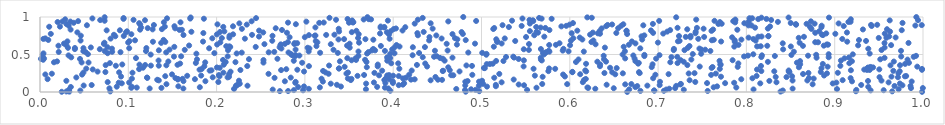
| Category | Series 0 |
|---|---|
| 0.664995956694161 | 0.001 |
| 0.9989362232849331 | 0.002 |
| 0.024639402178469938 | 0.003 |
| 0.482119969089313 | 0.004 |
| 0.03322009494285516 | 0.005 |
| 0.8386567524041421 | 0.006 |
| 0.029859937193917108 | 0.007 |
| 0.07963466957740173 | 0.008 |
| 0.965152407809273 | 0.009 |
| 0.9240435501453452 | 0.01 |
| 0.49744229192761913 | 0.011 |
| 0.2716573092140552 | 0.012 |
| 0.2809765765088632 | 0.013 |
| 0.7561589713562985 | 0.014 |
| 0.6799445542967725 | 0.015 |
| 0.7065505978965135 | 0.016 |
| 0.39665099776993407 | 0.017 |
| 0.6957691135875862 | 0.018 |
| 0.045671469405751175 | 0.019 |
| 0.8412257438737879 | 0.02 |
| 0.6955227239547089 | 0.021 |
| 0.9406701062007451 | 0.022 |
| 0.2979325662061413 | 0.023 |
| 0.9554827139419098 | 0.024 |
| 0.2875414308775337 | 0.025 |
| 0.48135020899788805 | 0.026 |
| 0.5516425678795928 | 0.027 |
| 0.9244853523116181 | 0.028 |
| 0.49333674763497304 | 0.029 |
| 0.7290932280535158 | 0.03 |
| 0.03286770507293879 | 0.031 |
| 0.2635450522684133 | 0.032 |
| 0.7092554660332971 | 0.033 |
| 0.808065388580854 | 0.034 |
| 0.6672584921421142 | 0.035 |
| 0.48823726595747896 | 0.036 |
| 0.36912294008398217 | 0.037 |
| 0.9723795257499287 | 0.038 |
| 0.90263160167634 | 0.039 |
| 0.47145976300835457 | 0.04 |
| 0.21974828644287558 | 0.041 |
| 0.30443231938226845 | 0.042 |
| 0.628869394943446 | 0.043 |
| 0.7126670233093978 | 0.044 |
| 0.852343542686936 | 0.045 |
| 0.16234978106327858 | 0.046 |
| 0.12418896208187746 | 0.047 |
| 0.3944795121743325 | 0.048 |
| 0.07858904973238956 | 0.049 |
| 0.649761555942909 | 0.05 |
| 0.7192745569571316 | 0.051 |
| 0.9863874506443138 | 0.052 |
| 0.9998205607760713 | 0.053 |
| 0.6208467202864248 | 0.054 |
| 0.13751590419339454 | 0.055 |
| 0.10339359894056177 | 0.056 |
| 0.5622760565363885 | 0.057 |
| 0.3906122875469086 | 0.058 |
| 0.10958476435433029 | 0.059 |
| 0.7885634697478714 | 0.06 |
| 0.619932857702622 | 0.061 |
| 0.31694334041106564 | 0.062 |
| 0.7629007265837633 | 0.063 |
| 0.18100451814252205 | 0.064 |
| 0.6742234331277013 | 0.065 |
| 0.29235029882932084 | 0.066 |
| 0.0349049358146577 | 0.067 |
| 0.38183512772812445 | 0.068 |
| 0.9380153457905355 | 0.069 |
| 0.10405561700919053 | 0.07 |
| 0.08690831628308848 | 0.071 |
| 0.5062163441032591 | 0.072 |
| 0.3407870701486322 | 0.073 |
| 0.29898544358545864 | 0.074 |
| 0.7668107779129065 | 0.075 |
| 0.1566914096400247 | 0.076 |
| 0.5162740958150556 | 0.077 |
| 0.22180425773371892 | 0.078 |
| 0.6763732805177392 | 0.079 |
| 0.9677327866136145 | 0.08 |
| 0.9858529557865442 | 0.081 |
| 0.720514249835614 | 0.082 |
| 0.4970140474261846 | 0.083 |
| 0.23497995062268795 | 0.084 |
| 0.6878320533775083 | 0.085 |
| 0.04945418795839285 | 0.086 |
| 0.22231139325291827 | 0.087 |
| 0.4815976988094496 | 0.088 |
| 0.9767111810893743 | 0.089 |
| 0.5482016907851018 | 0.09 |
| 0.40632995556464635 | 0.091 |
| 0.7017643485102744 | 0.092 |
| 0.0585155312332829 | 0.093 |
| 0.9300062283799445 | 0.094 |
| 0.5162392449187526 | 0.095 |
| 0.3362247592345575 | 0.096 |
| 0.6417288786274516 | 0.097 |
| 0.41096644085029566 | 0.098 |
| 0.22392367089158893 | 0.099 |
| 0.5421323926709913 | 0.1 |
| 0.7253654530042826 | 0.101 |
| 0.6627615395295284 | 0.102 |
| 0.8750006179527815 | 0.103 |
| 0.14320060195090445 | 0.104 |
| 0.5970235258154841 | 0.105 |
| 0.6696929063289269 | 0.106 |
| 0.5687658955322499 | 0.107 |
| 0.7257594551004029 | 0.108 |
| 0.5017607079965017 | 0.109 |
| 0.22622253023249483 | 0.11 |
| 0.3292964107008204 | 0.111 |
| 0.36933966101716675 | 0.112 |
| 0.9738164486355505 | 0.113 |
| 0.8977710365653785 | 0.114 |
| 0.815705105575137 | 0.115 |
| 0.0926321880823372 | 0.116 |
| 0.4124002391681474 | 0.117 |
| 0.775897240836362 | 0.118 |
| 0.7554403851241233 | 0.119 |
| 0.39967507265545743 | 0.12 |
| 0.3911147315318967 | 0.121 |
| 0.2891351103196761 | 0.122 |
| 0.7861343288909702 | 0.123 |
| 0.08917332464436845 | 0.124 |
| 0.9019413617657434 | 0.125 |
| 0.10094322744784334 | 0.126 |
| 0.3781922948105787 | 0.127 |
| 0.9610295536397262 | 0.128 |
| 0.5227941025255641 | 0.129 |
| 0.8340503031207283 | 0.13 |
| 0.6147985309024946 | 0.131 |
| 0.07665726391792826 | 0.132 |
| 0.20196275594506352 | 0.133 |
| 0.7420968834665234 | 0.134 |
| 0.28952485133135386 | 0.135 |
| 0.7021593393391504 | 0.136 |
| 0.48165876890882875 | 0.137 |
| 0.4971947760922043 | 0.138 |
| 0.3203820387342028 | 0.139 |
| 0.9871902154081982 | 0.14 |
| 0.399610864715808 | 0.141 |
| 0.9196081852001261 | 0.142 |
| 0.27733536106255363 | 0.143 |
| 0.1873081885730079 | 0.144 |
| 0.16245379734417775 | 0.145 |
| 0.4842512096089482 | 0.146 |
| 0.9377293274724892 | 0.147 |
| 0.8259808009452639 | 0.148 |
| 0.029831812250912026 | 0.149 |
| 0.5006329909631198 | 0.15 |
| 0.2253407610345789 | 0.151 |
| 0.9529939760306166 | 0.152 |
| 0.8522705452006918 | 0.153 |
| 0.8690075208608636 | 0.154 |
| 0.13453700069108454 | 0.155 |
| 0.44239342048419006 | 0.156 |
| 0.7356749778320286 | 0.157 |
| 0.909002447645932 | 0.158 |
| 0.35203578651775913 | 0.159 |
| 0.38996757677737137 | 0.16 |
| 0.6162018890036507 | 0.161 |
| 0.4553527233664628 | 0.162 |
| 0.13274318642951388 | 0.163 |
| 0.45062851908386725 | 0.164 |
| 0.42017824519645364 | 0.165 |
| 0.5364724039135773 | 0.166 |
| 0.15599365604124926 | 0.167 |
| 0.39582947971805627 | 0.168 |
| 0.4243172975310896 | 0.169 |
| 0.7941869137465567 | 0.17 |
| 0.17546334405402086 | 0.171 |
| 0.008597140693546224 | 0.172 |
| 0.15635040332995964 | 0.173 |
| 0.618127302958083 | 0.174 |
| 0.3527485238842816 | 0.175 |
| 0.16138771922750195 | 0.176 |
| 0.3188584174554604 | 0.177 |
| 0.1040769233976967 | 0.178 |
| 0.8762094194310122 | 0.179 |
| 0.34865569882325853 | 0.18 |
| 0.4110970681941938 | 0.181 |
| 0.3916772851655196 | 0.182 |
| 0.8068133030844657 | 0.183 |
| 0.6943733922313157 | 0.184 |
| 0.9180187947152834 | 0.185 |
| 0.15335082269279798 | 0.186 |
| 0.8708185406327933 | 0.187 |
| 0.12151390634799797 | 0.188 |
| 0.26564017037447374 | 0.189 |
| 0.5144401121918051 | 0.19 |
| 0.4144617067269738 | 0.191 |
| 0.28396782460597436 | 0.192 |
| 0.12120098762020137 | 0.193 |
| 0.041132545388296804 | 0.194 |
| 0.21243299640732372 | 0.195 |
| 0.19563203783577177 | 0.196 |
| 0.9716317517880783 | 0.197 |
| 0.9507577447227504 | 0.198 |
| 0.8454109385040243 | 0.199 |
| 0.4478355344444609 | 0.2 |
| 0.833186304579286 | 0.201 |
| 0.2140155384229404 | 0.202 |
| 0.5692521655058993 | 0.203 |
| 0.771210817161665 | 0.204 |
| 0.964329577574726 | 0.205 |
| 0.09178368092501488 | 0.206 |
| 0.594464120085195 | 0.207 |
| 0.20329873302038381 | 0.208 |
| 0.9794870866290231 | 0.209 |
| 0.8517215438499014 | 0.21 |
| 0.1418534367232951 | 0.211 |
| 0.4062666208521446 | 0.212 |
| 0.9809388317019603 | 0.213 |
| 0.8115474978530332 | 0.214 |
| 0.3595940748420068 | 0.215 |
| 0.16670539672571827 | 0.216 |
| 0.3999406792674869 | 0.217 |
| 0.5604357653525732 | 0.218 |
| 0.18251540323851279 | 0.219 |
| 0.8879780276323658 | 0.22 |
| 0.3932162829857837 | 0.221 |
| 0.3839955194016875 | 0.222 |
| 0.4680794566091936 | 0.223 |
| 0.4656444644109802 | 0.224 |
| 0.39539068147758316 | 0.225 |
| 0.2025800324719781 | 0.226 |
| 0.36703443128338076 | 0.227 |
| 0.7600771645892883 | 0.228 |
| 0.48959558339155673 | 0.229 |
| 0.6969193688298749 | 0.23 |
| 0.41812309039581474 | 0.231 |
| 0.04765746878864008 | 0.232 |
| 0.5924344154308621 | 0.233 |
| 0.00604333581754124 | 0.234 |
| 0.1495087289991679 | 0.235 |
| 0.6514701061108102 | 0.236 |
| 0.6117707827524551 | 0.237 |
| 0.7118694744884789 | 0.238 |
| 0.21422476892442777 | 0.239 |
| 0.8641721432652866 | 0.24 |
| 0.5201570916435669 | 0.241 |
| 0.25880269269860945 | 0.242 |
| 0.32683973655210574 | 0.243 |
| 0.013440300296736707 | 0.244 |
| 0.7653788608172658 | 0.245 |
| 0.34705625611115765 | 0.246 |
| 0.7346521506037512 | 0.247 |
| 0.8912555131335221 | 0.248 |
| 0.6600649161477652 | 0.249 |
| 0.9721544903124087 | 0.25 |
| 0.7412573601608906 | 0.251 |
| 0.6791817071595231 | 0.252 |
| 0.6392155685915084 | 0.253 |
| 0.8702584520341667 | 0.254 |
| 0.3787415983117217 | 0.255 |
| 0.9035150553378435 | 0.256 |
| 0.10473057699347965 | 0.257 |
| 0.20770067702235295 | 0.258 |
| 0.049196408339648334 | 0.259 |
| 0.3488036154507085 | 0.26 |
| 0.3233706956362046 | 0.261 |
| 0.0896152838321258 | 0.262 |
| 0.6480625398553224 | 0.263 |
| 0.6028966065987703 | 0.264 |
| 0.6783525779212702 | 0.265 |
| 0.07406356627818433 | 0.266 |
| 0.8842538073438672 | 0.267 |
| 0.8487528292948048 | 0.268 |
| 0.6029228487981346 | 0.269 |
| 0.8480263855116514 | 0.27 |
| 0.2158121716790783 | 0.271 |
| 0.06522114632696463 | 0.272 |
| 0.299021284653456 | 0.273 |
| 0.4751365105669594 | 0.274 |
| 0.6185375859207027 | 0.275 |
| 0.8315716054609771 | 0.276 |
| 0.9736398869592082 | 0.277 |
| 0.5757252568511658 | 0.278 |
| 0.8169159935713257 | 0.279 |
| 0.4561004191215201 | 0.28 |
| 0.32059422932697146 | 0.281 |
| 0.9664001021020976 | 0.282 |
| 0.45651675812107684 | 0.283 |
| 0.38746816284732777 | 0.284 |
| 0.19214426092630654 | 0.285 |
| 0.420959282760501 | 0.286 |
| 0.8478866276503217 | 0.287 |
| 0.6175203783228478 | 0.288 |
| 0.19422515009989527 | 0.289 |
| 0.9183580112547455 | 0.29 |
| 0.4640642139005281 | 0.291 |
| 0.2730556403106048 | 0.292 |
| 0.2269629512248751 | 0.293 |
| 0.9395766528471382 | 0.294 |
| 0.93658037627658 | 0.295 |
| 0.9988053305528792 | 0.296 |
| 0.2914269342009719 | 0.297 |
| 0.18070184987710636 | 0.298 |
| 0.9334690723601481 | 0.299 |
| 0.8120463514872602 | 0.3 |
| 0.05972533756665355 | 0.301 |
| 0.9505124465489931 | 0.302 |
| 0.9395398120760506 | 0.303 |
| 0.27891038910420307 | 0.304 |
| 0.11227043663685932 | 0.305 |
| 0.18310995811914754 | 0.306 |
| 0.9988748959931643 | 0.307 |
| 0.7698963592652389 | 0.308 |
| 0.583418475520655 | 0.309 |
| 0.558951273858262 | 0.31 |
| 0.4069511385039546 | 0.311 |
| 0.05240075284746393 | 0.312 |
| 0.33844315916439005 | 0.313 |
| 0.5765728182137889 | 0.314 |
| 0.33874285594471976 | 0.315 |
| 0.9370378859460283 | 0.316 |
| 0.8850462510572035 | 0.317 |
| 0.5037394301904423 | 0.318 |
| 0.6530911617963674 | 0.319 |
| 0.5027502759145895 | 0.32 |
| 0.760649028352506 | 0.321 |
| 0.20352400894543876 | 0.322 |
| 0.6456058229840881 | 0.323 |
| 0.11672644181588898 | 0.324 |
| 0.9413287558919382 | 0.325 |
| 0.9377085031819504 | 0.326 |
| 0.20033447081364908 | 0.327 |
| 0.9434585260659986 | 0.328 |
| 0.4623445902416935 | 0.329 |
| 0.8594655359973642 | 0.33 |
| 0.37010108771369654 | 0.331 |
| 0.6927872432381599 | 0.332 |
| 0.7616554511288727 | 0.333 |
| 0.9404033124907571 | 0.334 |
| 0.790140893137727 | 0.335 |
| 0.3450154157929606 | 0.336 |
| 0.892029529643712 | 0.337 |
| 0.9935180667602712 | 0.338 |
| 0.7471417176081913 | 0.339 |
| 0.4384025095379799 | 0.34 |
| 0.547693691131815 | 0.341 |
| 0.38245028281201676 | 0.342 |
| 0.18608450826330614 | 0.343 |
| 0.6341875822090094 | 0.344 |
| 0.30458916445264295 | 0.345 |
| 0.23473481266466434 | 0.346 |
| 0.8165275051139634 | 0.347 |
| 0.48924245572042335 | 0.348 |
| 0.9064162051231591 | 0.349 |
| 0.0858978536449837 | 0.35 |
| 0.13451000059647855 | 0.351 |
| 0.12557603699078912 | 0.352 |
| 0.32740009840218354 | 0.353 |
| 0.4829266191830518 | 0.354 |
| 0.9631679404189583 | 0.355 |
| 0.14309698713146235 | 0.356 |
| 0.9739947128719212 | 0.357 |
| 0.07438014867685006 | 0.358 |
| 0.7331202529571487 | 0.359 |
| 0.11910046817140796 | 0.36 |
| 0.4268823223252777 | 0.361 |
| 0.7707975909919718 | 0.362 |
| 0.15572209933422998 | 0.363 |
| 0.20811566356275524 | 0.364 |
| 0.11262498853074232 | 0.365 |
| 0.3825217966413038 | 0.366 |
| 0.09316549596082191 | 0.367 |
| 0.6344030074512487 | 0.368 |
| 0.6937430586184516 | 0.369 |
| 0.8608959006607368 | 0.37 |
| 0.770511655998946 | 0.371 |
| 0.5059360718692864 | 0.372 |
| 0.5094482562841872 | 0.373 |
| 0.8865548015371739 | 0.374 |
| 0.9797845124445909 | 0.375 |
| 0.6184214014700511 | 0.376 |
| 0.5127454566893176 | 0.377 |
| 0.6774089920920161 | 0.378 |
| 0.15869348104596426 | 0.379 |
| 0.4362950854125085 | 0.38 |
| 0.7908612261496841 | 0.381 |
| 0.4056511761684055 | 0.382 |
| 0.3977636815090697 | 0.383 |
| 0.9165538547730491 | 0.384 |
| 0.07914981062119464 | 0.385 |
| 0.7219756494566416 | 0.386 |
| 0.17648641113603725 | 0.387 |
| 0.6781200252980386 | 0.388 |
| 0.9841109674605477 | 0.389 |
| 0.2968538532538718 | 0.39 |
| 0.8572317824612777 | 0.391 |
| 0.253075959545097 | 0.392 |
| 0.05497466770276116 | 0.393 |
| 0.04715905593484926 | 0.394 |
| 0.18710047983930345 | 0.395 |
| 0.01584625501023995 | 0.396 |
| 0.7138319454215541 | 0.397 |
| 0.22135580158871748 | 0.398 |
| 0.21027546984735546 | 0.399 |
| 0.6070185616348359 | 0.4 |
| 0.3697611523550878 | 0.401 |
| 0.8243472977997774 | 0.402 |
| 0.729057169590337 | 0.403 |
| 0.6312016860836336 | 0.404 |
| 0.641054114406527 | 0.405 |
| 0.9669564360504287 | 0.406 |
| 0.14533486640257276 | 0.407 |
| 0.01933462506832595 | 0.408 |
| 0.33963492206488344 | 0.409 |
| 0.9194923599275344 | 0.41 |
| 0.6743139921323613 | 0.411 |
| 0.86076122518671 | 0.412 |
| 0.5248558238752022 | 0.413 |
| 0.5165779039392876 | 0.414 |
| 0.7695850985777732 | 0.415 |
| 0.2874100032679304 | 0.416 |
| 0.3932747153371414 | 0.417 |
| 0.4582536877897797 | 0.418 |
| 0.9070204940501626 | 0.419 |
| 0.13426960108851171 | 0.42 |
| 0.568286561602951 | 0.421 |
| 0.5479889732098501 | 0.422 |
| 0.35289660176588644 | 0.423 |
| 0.7843732196703413 | 0.424 |
| 0.7255074205405314 | 0.425 |
| 0.253090837536058 | 0.426 |
| 0.20725737035868674 | 0.427 |
| 0.3579495519008522 | 0.428 |
| 0.368144098357026 | 0.429 |
| 0.003609882948350962 | 0.43 |
| 0.567345770878499 | 0.431 |
| 0.9824925220423737 | 0.432 |
| 0.7376581935293413 | 0.433 |
| 0.6098416405724775 | 0.434 |
| 0.1777913110308933 | 0.435 |
| 0.9516307191574135 | 0.436 |
| 0.6387550464117363 | 0.437 |
| 0.23665319185590317 | 0.438 |
| 0.35753294967496396 | 0.439 |
| 0.5420710756471024 | 0.44 |
| 0.04528776351197872 | 0.441 |
| 0.001065199193019617 | 0.442 |
| 0.2688954929514559 | 0.443 |
| 0.4562336109808959 | 0.444 |
| 0.6977300252969728 | 0.445 |
| 0.6733692872627002 | 0.446 |
| 0.0045890201856741974 | 0.447 |
| 0.6627207424167312 | 0.448 |
| 0.911090232338155 | 0.449 |
| 0.3574266801533238 | 0.45 |
| 0.34804915800140757 | 0.451 |
| 0.10869490096334333 | 0.452 |
| 0.39659655908149083 | 0.453 |
| 0.45304674327413086 | 0.454 |
| 0.9564687338509377 | 0.455 |
| 0.5671493876785038 | 0.456 |
| 0.8794503264802339 | 0.457 |
| 0.4671297975413582 | 0.458 |
| 0.5368555482062505 | 0.459 |
| 0.9161665444484721 | 0.46 |
| 0.3931005008394597 | 0.461 |
| 0.03535914873683854 | 0.462 |
| 0.8931843824659723 | 0.463 |
| 0.43345729538548494 | 0.464 |
| 0.715109821033382 | 0.465 |
| 0.8169171195129267 | 0.466 |
| 0.5278116408253125 | 0.467 |
| 0.7216743744706786 | 0.468 |
| 0.9894640865924588 | 0.469 |
| 0.4462521310159513 | 0.47 |
| 0.5359868246070888 | 0.471 |
| 0.15171659513859526 | 0.472 |
| 0.9753272448541794 | 0.473 |
| 0.797406984989296 | 0.474 |
| 0.21256326543908854 | 0.475 |
| 0.15985312235450888 | 0.476 |
| 0.28887947420086557 | 0.477 |
| 0.4492003992985122 | 0.478 |
| 0.6844196103960225 | 0.479 |
| 0.832237784072815 | 0.48 |
| 0.3605557073003829 | 0.481 |
| 0.9921381005261297 | 0.482 |
| 0.6383646049997446 | 0.483 |
| 0.8698320278005215 | 0.484 |
| 0.8017738504754014 | 0.485 |
| 0.29377557604471327 | 0.486 |
| 0.6719521430300885 | 0.487 |
| 0.032325511078803215 | 0.488 |
| 0.8176083393368238 | 0.489 |
| 0.42196414608985167 | 0.49 |
| 0.7015669256659783 | 0.491 |
| 0.28537130314975756 | 0.492 |
| 0.2892658155306467 | 0.493 |
| 0.8509702286477033 | 0.494 |
| 0.684474806424337 | 0.495 |
| 0.8790282982540619 | 0.496 |
| 0.5054214847587206 | 0.497 |
| 0.003084057752604674 | 0.498 |
| 0.1253788649591212 | 0.499 |
| 0.6598126425567604 | 0.5 |
| 0.5707315964259013 | 0.501 |
| 0.9204843200789643 | 0.502 |
| 0.8078007476281536 | 0.503 |
| 0.8931601338328371 | 0.504 |
| 0.054265570979204814 | 0.505 |
| 0.7392763846086186 | 0.506 |
| 0.28409457529879 | 0.507 |
| 0.5057322847492561 | 0.508 |
| 0.39659800627233877 | 0.509 |
| 0.7487816477511435 | 0.51 |
| 0.17711237964994053 | 0.511 |
| 0.939618033010931 | 0.512 |
| 0.37043668486666925 | 0.513 |
| 0.22274880850430956 | 0.514 |
| 0.003910546975745999 | 0.515 |
| 0.4014561830104214 | 0.516 |
| 0.07659777614914876 | 0.517 |
| 0.19746949791578838 | 0.518 |
| 0.5696767303220253 | 0.519 |
| 0.4293309545693166 | 0.52 |
| 0.3372583552665628 | 0.521 |
| 0.5008392717607723 | 0.522 |
| 0.3172587464466834 | 0.523 |
| 0.5722280002180958 | 0.524 |
| 0.22847073020405717 | 0.525 |
| 0.48503300728387666 | 0.526 |
| 0.28143568238501293 | 0.527 |
| 0.1429007073988413 | 0.528 |
| 0.2589936463707794 | 0.529 |
| 0.5733209531434309 | 0.53 |
| 0.09114428975442279 | 0.531 |
| 0.3719574532978067 | 0.532 |
| 0.05159812220973392 | 0.533 |
| 0.02121683083643877 | 0.534 |
| 0.2652939143403775 | 0.535 |
| 0.08174173907226279 | 0.536 |
| 0.8537638717674954 | 0.537 |
| 0.5769140702217955 | 0.538 |
| 0.6158555109565599 | 0.539 |
| 0.3606495443762904 | 0.54 |
| 0.3042621774610569 | 0.541 |
| 0.5985966940223713 | 0.542 |
| 0.6624183561962566 | 0.543 |
| 0.049097048336360194 | 0.544 |
| 0.07331328506649037 | 0.545 |
| 0.12005160318242492 | 0.546 |
| 0.7592198322854052 | 0.547 |
| 0.3906348592619844 | 0.548 |
| 0.9751001615820348 | 0.549 |
| 0.44724481186103127 | 0.55 |
| 0.5761323319907928 | 0.551 |
| 0.5919959100797959 | 0.552 |
| 0.4616305598147057 | 0.553 |
| 0.3758156754654275 | 0.554 |
| 0.3794840729139396 | 0.555 |
| 0.134592696438392 | 0.556 |
| 0.21292936106024207 | 0.557 |
| 0.7298980999151796 | 0.558 |
| 0.717683401520974 | 0.559 |
| 0.9530513810486198 | 0.56 |
| 0.5536430170284646 | 0.561 |
| 0.16393191571478627 | 0.562 |
| 0.3324024708650902 | 0.563 |
| 0.753366821950418 | 0.564 |
| 0.14672862892955907 | 0.565 |
| 0.28944173585158217 | 0.566 |
| 0.748783765764643 | 0.567 |
| 0.3988601910109556 | 0.568 |
| 0.8416140800609168 | 0.569 |
| 0.5479087476263059 | 0.57 |
| 0.06775242727449038 | 0.571 |
| 0.039479625134377416 | 0.572 |
| 0.5672621618673251 | 0.573 |
| 0.37740713742396803 | 0.574 |
| 0.717916547291887 | 0.575 |
| 0.592814531047496 | 0.576 |
| 0.9380570248782513 | 0.577 |
| 0.08148621800954159 | 0.578 |
| 0.7467918095932212 | 0.579 |
| 0.27338322712648744 | 0.58 |
| 0.3051354627553603 | 0.581 |
| 0.6798250294294582 | 0.582 |
| 0.19154210419266282 | 0.583 |
| 0.10103144751643134 | 0.584 |
| 0.049187209232631424 | 0.585 |
| 0.12047338529759766 | 0.586 |
| 0.03951754581553513 | 0.587 |
| 0.7335381071826971 | 0.588 |
| 0.03169720292929601 | 0.589 |
| 0.30306244713600283 | 0.59 |
| 0.35074515824389696 | 0.591 |
| 0.6397454727070159 | 0.592 |
| 0.956554853317264 | 0.593 |
| 0.05756244152511392 | 0.594 |
| 0.4014830216170828 | 0.595 |
| 0.2713591320520896 | 0.596 |
| 0.42225747792715573 | 0.597 |
| 0.07632640661905266 | 0.598 |
| 0.4359397396796546 | 0.599 |
| 0.21543474514483463 | 0.6 |
| 0.24431145327697446 | 0.601 |
| 0.15209946279466846 | 0.602 |
| 0.6610638623011206 | 0.603 |
| 0.513970011650166 | 0.604 |
| 0.7862992617529839 | 0.605 |
| 0.407183225160779 | 0.606 |
| 0.8503085212379449 | 0.607 |
| 0.8121514727788384 | 0.608 |
| 0.21445462532418902 | 0.609 |
| 0.816259780051336 | 0.61 |
| 0.2109490535284011 | 0.611 |
| 0.31307321973002855 | 0.612 |
| 0.7355622905452358 | 0.613 |
| 0.38602625666334345 | 0.614 |
| 0.8640359238611943 | 0.615 |
| 0.82360446295256 | 0.616 |
| 0.020896723311227938 | 0.617 |
| 0.8876854175885802 | 0.618 |
| 0.3477581578376495 | 0.619 |
| 0.16885756620191716 | 0.62 |
| 0.029987960266085967 | 0.621 |
| 0.9265198861484911 | 0.622 |
| 0.2723311905157151 | 0.623 |
| 0.6003045535083491 | 0.624 |
| 0.9638797542123446 | 0.625 |
| 0.40373766168815206 | 0.626 |
| 0.5766939205300083 | 0.627 |
| 0.7910210144764949 | 0.628 |
| 0.5842880666187675 | 0.629 |
| 0.6669331116442613 | 0.63 |
| 0.8924965354412252 | 0.631 |
| 0.4721616388674169 | 0.632 |
| 0.20058998165143382 | 0.633 |
| 0.8910470350863167 | 0.634 |
| 0.27272175969376344 | 0.635 |
| 0.6291970752249686 | 0.636 |
| 0.3293383962594981 | 0.637 |
| 0.2541722858064849 | 0.638 |
| 0.5537789958036572 | 0.639 |
| 0.2879803799211226 | 0.64 |
| 0.07237223447982732 | 0.641 |
| 0.27737848197598314 | 0.642 |
| 0.4605537089110693 | 0.643 |
| 0.35061479415883134 | 0.644 |
| 0.4926438386874822 | 0.645 |
| 0.027189415675961337 | 0.646 |
| 0.5228233306550438 | 0.647 |
| 0.6743502234977682 | 0.648 |
| 0.8411486819673925 | 0.649 |
| 0.5883324708198799 | 0.65 |
| 0.2912950558806414 | 0.651 |
| 0.28837236601299254 | 0.652 |
| 0.9564003785315163 | 0.653 |
| 0.9835986732301055 | 0.654 |
| 0.1372471304819285 | 0.655 |
| 0.8603290862117361 | 0.656 |
| 0.0729807645477093 | 0.657 |
| 0.36129631242692517 | 0.658 |
| 0.6997669570433549 | 0.659 |
| 0.09983888578044475 | 0.66 |
| 0.2041682781722053 | 0.661 |
| 0.3141357386828826 | 0.662 |
| 0.8811675929617284 | 0.663 |
| 0.8779464192003384 | 0.664 |
| 0.2807378200084256 | 0.665 |
| 0.6244961901040076 | 0.666 |
| 0.517847191245517 | 0.667 |
| 0.14190736907777213 | 0.668 |
| 0.7868216707904381 | 0.669 |
| 0.12789996255765235 | 0.67 |
| 0.9141488774565777 | 0.671 |
| 0.1846384932614853 | 0.672 |
| 0.7713716594107967 | 0.673 |
| 0.6702767446095429 | 0.674 |
| 0.03104928588427036 | 0.675 |
| 0.7224766511016139 | 0.676 |
| 0.5176681802551133 | 0.677 |
| 0.10134043025947503 | 0.678 |
| 0.31229814568821046 | 0.679 |
| 0.5382020530672326 | 0.68 |
| 0.9354950099305847 | 0.681 |
| 0.7243289012922993 | 0.682 |
| 0.2630021207524599 | 0.683 |
| 0.6012235952335852 | 0.684 |
| 0.8104462599575316 | 0.685 |
| 0.04595286862364856 | 0.686 |
| 0.6267120210406663 | 0.687 |
| 0.44070735217508283 | 0.688 |
| 0.10762837818511617 | 0.689 |
| 0.7608027191653193 | 0.69 |
| 0.7866946902890913 | 0.691 |
| 0.4821381909647082 | 0.692 |
| 0.9274815324352335 | 0.693 |
| 0.009365830810488585 | 0.694 |
| 0.1399465702232009 | 0.695 |
| 0.7630629029691941 | 0.696 |
| 0.37749046201277425 | 0.697 |
| 0.7943224601187256 | 0.698 |
| 0.6819461593139099 | 0.699 |
| 0.6142056555325311 | 0.7 |
| 0.3380221841557265 | 0.701 |
| 0.4726343045207849 | 0.702 |
| 0.5167282360512302 | 0.703 |
| 0.3685474394268009 | 0.704 |
| 0.3443871058442969 | 0.705 |
| 0.8079069898043996 | 0.706 |
| 0.9085979186005226 | 0.707 |
| 0.0037496352571343428 | 0.708 |
| 0.7454895076417205 | 0.709 |
| 0.39593668955137984 | 0.71 |
| 0.23204630072075605 | 0.711 |
| 0.07997528042939872 | 0.712 |
| 0.4548307700817481 | 0.713 |
| 0.5263299578421872 | 0.714 |
| 0.006079213059047017 | 0.715 |
| 0.1951331294283788 | 0.716 |
| 0.6039683914153543 | 0.717 |
| 0.4699450206193061 | 0.718 |
| 0.2059374794763641 | 0.719 |
| 0.3602428538359189 | 0.72 |
| 0.9498752159594905 | 0.721 |
| 0.8592700352355793 | 0.722 |
| 0.9585226231213957 | 0.723 |
| 0.21443734214377796 | 0.724 |
| 0.8024788219045504 | 0.725 |
| 0.611290864275797 | 0.726 |
| 0.9690062585755695 | 0.727 |
| 0.7366426841958167 | 0.728 |
| 0.7838413275717706 | 0.729 |
| 0.2826793592271646 | 0.73 |
| 0.29992286605893426 | 0.731 |
| 0.441074998661266 | 0.732 |
| 0.550476744008376 | 0.733 |
| 0.7521585029576822 | 0.734 |
| 0.7313309739547733 | 0.735 |
| 0.8651855179889736 | 0.736 |
| 0.8134363210643304 | 0.737 |
| 0.5711113333111688 | 0.738 |
| 0.24801709407675088 | 0.739 |
| 0.8172064019330432 | 0.74 |
| 0.9616718694003618 | 0.741 |
| 0.6812279191108975 | 0.742 |
| 0.08530030172450176 | 0.743 |
| 0.8248937031371428 | 0.744 |
| 0.8248378358426451 | 0.745 |
| 0.7236811638231354 | 0.746 |
| 0.09486565643682765 | 0.747 |
| 0.7368192508337472 | 0.748 |
| 0.2633055435682703 | 0.749 |
| 0.31109574147530705 | 0.75 |
| 0.046199876059264344 | 0.751 |
| 0.2147080835359767 | 0.752 |
| 0.31192479643486093 | 0.753 |
| 0.4488228136770024 | 0.754 |
| 0.6844001709518003 | 0.755 |
| 0.427985873408534 | 0.756 |
| 0.5597518388067672 | 0.757 |
| 0.3045656113112859 | 0.758 |
| 0.8867232171681582 | 0.759 |
| 0.1624936663693487 | 0.76 |
| 0.3241042622477237 | 0.761 |
| 0.24012207687731912 | 0.762 |
| 0.08372904349526389 | 0.763 |
| 0.3334225882822497 | 0.764 |
| 0.6229770719147896 | 0.765 |
| 0.8854242298264663 | 0.766 |
| 0.39526925074626407 | 0.767 |
| 0.20031990824675705 | 0.768 |
| 0.21868552839557076 | 0.769 |
| 0.10346338584661563 | 0.77 |
| 0.3609477368567171 | 0.771 |
| 0.4671336913185803 | 0.772 |
| 0.6649275927513364 | 0.773 |
| 0.4788667983476905 | 0.774 |
| 0.0122380019305105 | 0.775 |
| 0.90072713653178 | 0.776 |
| 0.6342279179620817 | 0.777 |
| 0.9567025983808636 | 0.778 |
| 0.7058151155117818 | 0.779 |
| 0.38510526259779 | 0.78 |
| 0.8904411175001401 | 0.781 |
| 0.6318169745174317 | 0.782 |
| 0.7423246926638788 | 0.783 |
| 0.6020980217204221 | 0.784 |
| 0.42735855364638786 | 0.785 |
| 0.18498821121327258 | 0.786 |
| 0.652685380090359 | 0.787 |
| 0.6943619931936945 | 0.788 |
| 0.8779605567081668 | 0.789 |
| 0.2796547023577324 | 0.79 |
| 0.5640076753206317 | 0.791 |
| 0.6260842716225408 | 0.792 |
| 0.9138637644656586 | 0.793 |
| 0.25279501073449273 | 0.794 |
| 0.04230098287420192 | 0.795 |
| 0.0973902365053747 | 0.796 |
| 0.3928614992357329 | 0.797 |
| 0.35315345257877884 | 0.798 |
| 0.4774519320178925 | 0.799 |
| 0.20385014806149626 | 0.8 |
| 0.4345397652177623 | 0.801 |
| 0.562320378254735 | 0.802 |
| 0.17143025030297054 | 0.803 |
| 0.7425663093702526 | 0.804 |
| 0.7103547415352135 | 0.805 |
| 0.9626879723869012 | 0.806 |
| 0.33872175518895564 | 0.807 |
| 0.2087668905810658 | 0.808 |
| 0.09852951155690404 | 0.809 |
| 0.882473492356197 | 0.81 |
| 0.3972711220215859 | 0.811 |
| 0.5548198387405242 | 0.812 |
| 0.6338709446211175 | 0.813 |
| 0.664185432467944 | 0.814 |
| 0.7604619168058999 | 0.815 |
| 0.35829527399394046 | 0.816 |
| 0.6642586216270914 | 0.817 |
| 0.6084976849170588 | 0.818 |
| 0.2481221270259375 | 0.819 |
| 0.4105568089558991 | 0.82 |
| 0.6919126375817994 | 0.821 |
| 0.07549313076306385 | 0.822 |
| 0.09047518191083737 | 0.823 |
| 0.9759412703403824 | 0.824 |
| 0.7136423322263081 | 0.825 |
| 0.576949445904584 | 0.826 |
| 0.2740336628381628 | 0.827 |
| 0.1579102641280291 | 0.828 |
| 0.16071454259663753 | 0.829 |
| 0.7897103431380247 | 0.83 |
| 0.11337000453573343 | 0.831 |
| 0.03468616240452471 | 0.832 |
| 0.7623073735354834 | 0.833 |
| 0.9319766194470162 | 0.834 |
| 0.12751281133389258 | 0.835 |
| 0.7330115658644156 | 0.836 |
| 0.9592490771087647 | 0.837 |
| 0.13805696399666811 | 0.838 |
| 0.40054004515365105 | 0.839 |
| 0.5133512172257647 | 0.84 |
| 0.8736664877470834 | 0.841 |
| 0.22862925440677162 | 0.842 |
| 0.33828803532666085 | 0.843 |
| 0.7515013631140488 | 0.844 |
| 0.4446799870590411 | 0.845 |
| 0.82427171201789 | 0.846 |
| 0.4030750082479949 | 0.847 |
| 0.6360697752098476 | 0.848 |
| 0.1530584197054261 | 0.849 |
| 0.26696954822948493 | 0.85 |
| 0.6547886146039429 | 0.851 |
| 0.12201245899793145 | 0.852 |
| 0.5144046868140785 | 0.853 |
| 0.5722908046822168 | 0.854 |
| 0.7439925151926624 | 0.855 |
| 0.7220251725272914 | 0.856 |
| 0.3857492990054161 | 0.857 |
| 0.8098616253630284 | 0.858 |
| 0.5670049377166648 | 0.859 |
| 0.11452136691488135 | 0.86 |
| 0.3118865810757344 | 0.861 |
| 0.38981122225292353 | 0.862 |
| 0.8849698360246394 | 0.863 |
| 0.41368440543966434 | 0.864 |
| 0.39000652502690913 | 0.865 |
| 0.530999655198444 | 0.866 |
| 0.5619903403034083 | 0.867 |
| 0.20756567353321131 | 0.868 |
| 0.8719109974199426 | 0.869 |
| 0.010429201481828243 | 0.87 |
| 0.14137241832289604 | 0.871 |
| 0.022606460587334065 | 0.872 |
| 0.3858056855480422 | 0.873 |
| 0.8268400970849984 | 0.874 |
| 0.5904645116042883 | 0.875 |
| 0.21858686927224424 | 0.876 |
| 0.15225209309005439 | 0.877 |
| 0.6411788725025794 | 0.878 |
| 0.910222552137186 | 0.879 |
| 0.941877104101534 | 0.88 |
| 0.5454793246129189 | 0.881 |
| 0.5959565578935886 | 0.882 |
| 0.6582410029626079 | 0.883 |
| 0.8852414891174828 | 0.884 |
| 0.03243248758846062 | 0.885 |
| 0.9913443515242875 | 0.886 |
| 0.8058273877964705 | 0.887 |
| 0.8023134821252208 | 0.888 |
| 0.6832363824716116 | 0.889 |
| 0.05314517363572835 | 0.89 |
| 0.523834601100465 | 0.891 |
| 0.9985963115510972 | 0.892 |
| 0.12898878922201384 | 0.893 |
| 0.6428493743321011 | 0.894 |
| 0.9411864327767909 | 0.895 |
| 0.9481253320508785 | 0.896 |
| 0.856253918625196 | 0.897 |
| 0.5996558800429613 | 0.898 |
| 0.2341568930353486 | 0.899 |
| 0.6479263472838448 | 0.9 |
| 0.11350976919300149 | 0.901 |
| 0.20097740718092083 | 0.902 |
| 0.6605975147942031 | 0.903 |
| 0.2897700705394659 | 0.904 |
| 0.8560413749378918 | 0.905 |
| 0.02997044789618264 | 0.906 |
| 0.7682591126074794 | 0.907 |
| 0.694094069746326 | 0.908 |
| 0.868166165562553 | 0.909 |
| 0.7720176115444647 | 0.91 |
| 0.8772376304257548 | 0.911 |
| 0.4243631833445487 | 0.912 |
| 0.5547750010165061 | 0.913 |
| 0.9044182917951207 | 0.914 |
| 0.22574650497418913 | 0.915 |
| 0.4424190647892179 | 0.916 |
| 0.797676270088139 | 0.917 |
| 0.11232581925372354 | 0.918 |
| 0.6035986622705214 | 0.919 |
| 0.8502117211297932 | 0.92 |
| 0.976805817657447 | 0.921 |
| 0.3162573878271182 | 0.922 |
| 0.038139009277681435 | 0.923 |
| 0.34990687205951043 | 0.924 |
| 0.28086077997766556 | 0.925 |
| 0.3213244355260062 | 0.926 |
| 0.35421420155677863 | 0.927 |
| 0.7872789126929125 | 0.928 |
| 0.15912337840087276 | 0.929 |
| 0.1403214995065718 | 0.93 |
| 0.3548799315814023 | 0.931 |
| 0.7700150494406759 | 0.932 |
| 0.019938705309349047 | 0.933 |
| 0.9155446098907962 | 0.934 |
| 0.8357035547930989 | 0.935 |
| 0.9179536246426652 | 0.936 |
| 0.802689597204699 | 0.937 |
| 0.3016610686943644 | 0.938 |
| 0.03441539560431217 | 0.939 |
| 0.025368255349639823 | 0.94 |
| 0.4623746587791998 | 0.941 |
| 0.8730659147847112 | 0.942 |
| 0.23968389281684266 | 0.943 |
| 0.7851227419028899 | 0.944 |
| 0.0431604659827004 | 0.945 |
| 0.5586165948324883 | 0.946 |
| 0.493931462071592 | 0.947 |
| 0.7012138775598213 | 0.948 |
| 0.7638916505890385 | 0.949 |
| 0.07319493872070315 | 0.95 |
| 0.5345786132907321 | 0.951 |
| 0.39396659086456276 | 0.952 |
| 0.7873874188155919 | 0.953 |
| 0.35357356018886466 | 0.954 |
| 0.9623043585102972 | 0.955 |
| 0.5581642715424973 | 0.956 |
| 0.11888502605769669 | 0.957 |
| 0.99435724027873 | 0.958 |
| 0.06819780816309062 | 0.959 |
| 0.8280175766672717 | 0.96 |
| 0.5543061937308553 | 0.961 |
| 0.10591798040038602 | 0.962 |
| 0.335262381032047 | 0.963 |
| 0.42794679544834124 | 0.964 |
| 0.743162449843199 | 0.965 |
| 0.7874542933663762 | 0.966 |
| 0.3666000487575969 | 0.967 |
| 0.3749077653076469 | 0.968 |
| 0.028534753474910524 | 0.969 |
| 0.918213426296611 | 0.97 |
| 0.37240985190272813 | 0.971 |
| 0.8133929041186252 | 0.972 |
| 0.3483152982045489 | 0.973 |
| 0.8226707391917988 | 0.974 |
| 0.09459055876891109 | 0.975 |
| 0.5794377045002399 | 0.976 |
| 0.18562286782975224 | 0.977 |
| 0.5680962183584243 | 0.978 |
| 0.17012441673111034 | 0.979 |
| 0.5463887023551443 | 0.98 |
| 0.05933943020102184 | 0.981 |
| 0.14384569363013955 | 0.982 |
| 0.8065496534943034 | 0.983 |
| 0.803525349151064 | 0.984 |
| 0.2447070248612726 | 0.985 |
| 0.09468893497533093 | 0.986 |
| 0.5652417896093127 | 0.987 |
| 0.43338485778024527 | 0.988 |
| 0.3278433229822352 | 0.989 |
| 0.6248926652853317 | 0.99 |
| 0.8170290085023961 | 0.991 |
| 0.893526620289436 | 0.992 |
| 0.8477683568064779 | 0.993 |
| 0.17062968640863563 | 0.994 |
| 0.6198092493693076 | 0.995 |
| 0.7204943546073714 | 0.996 |
| 0.07320399377247411 | 0.997 |
| 0.3708462375257804 | 0.998 |
| 0.9924419404549841 | 0.999 |
| 0.4793487648919543 | 1 |